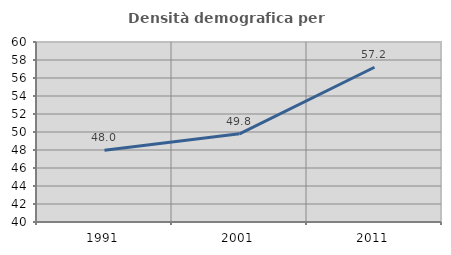
| Category | Densità demografica |
|---|---|
| 1991.0 | 47.966 |
| 2001.0 | 49.8 |
| 2011.0 | 57.192 |